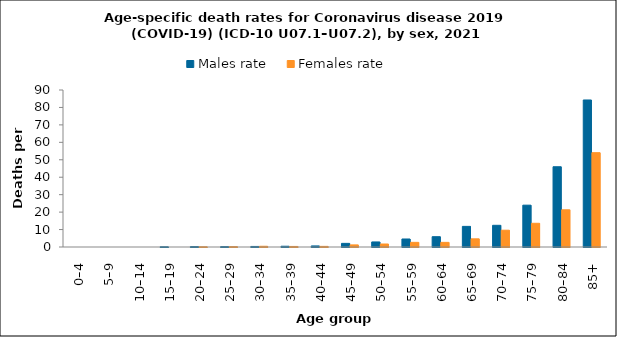
| Category | Males rate | Females rate |
|---|---|---|
| 0–4 | 0 | 0 |
| 5–9 | 0 | 0 |
| 10–14 | 0 | 0 |
| 15–19 | 0.131 | 0 |
| 20–24 | 0.239 | 0.127 |
| 25–29 | 0.218 | 0.221 |
| 30–34 | 0.319 | 0.417 |
| 35–39 | 0.431 | 0.319 |
| 40–44 | 0.613 | 0.358 |
| 45–49 | 2.08 | 1.201 |
| 50–54 | 2.896 | 1.713 |
| 55–59 | 4.59 | 2.665 |
| 60–64 | 5.906 | 2.653 |
| 65–69 | 11.821 | 4.678 |
| 70–74 | 12.439 | 9.627 |
| 75–79 | 23.979 | 13.592 |
| 80–84 | 46.007 | 21.324 |
| 85+ | 84.284 | 54.08 |